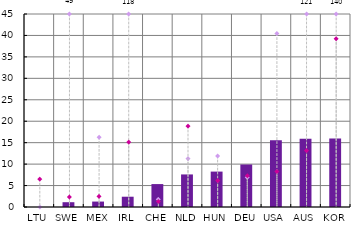
| Category | 2022  (↗) |
|---|---|
| LTU | 0 |
| SWE | 1.119 |
| MEX | 1.267 |
| IRL | 2.398 |
| CHE | 5.345 |
| NLD | 7.593 |
| HUN | 8.256 |
| DEU | 9.908 |
| USA | 15.592 |
| AUS | 15.897 |
| KOR | 15.989 |